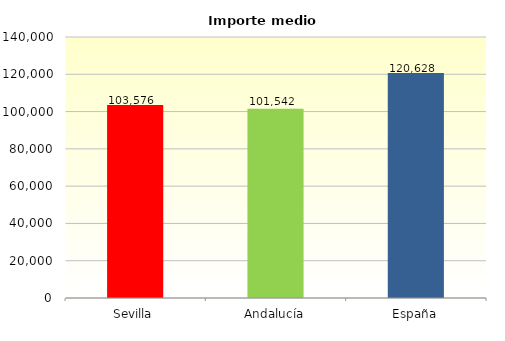
| Category | Series 2 |
|---|---|
| Sevilla | 103575.574 |
| Andalucía | 101541.985 |
| España | 120627.823 |